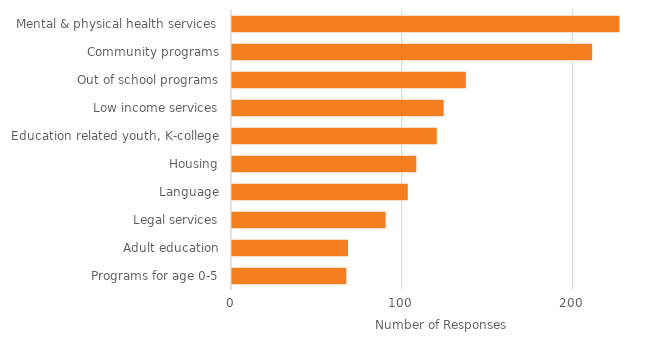
| Category | Series 0 |
|---|---|
| Programs for age 0-5 | 67 |
| Adult education | 68 |
| Legal services | 90 |
| Language | 103 |
| Housing | 108 |
| Education related youth, K-college | 120 |
| Low income services | 124 |
| Out of school programs | 137 |
| Community programs | 211 |
| Mental & physical health services | 227 |